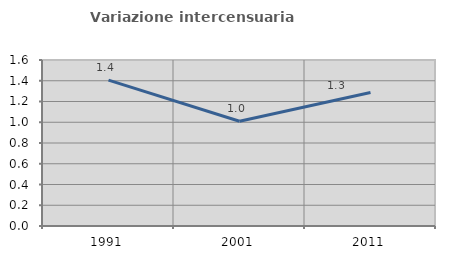
| Category | Variazione intercensuaria annua |
|---|---|
| 1991.0 | 1.406 |
| 2001.0 | 1.01 |
| 2011.0 | 1.287 |